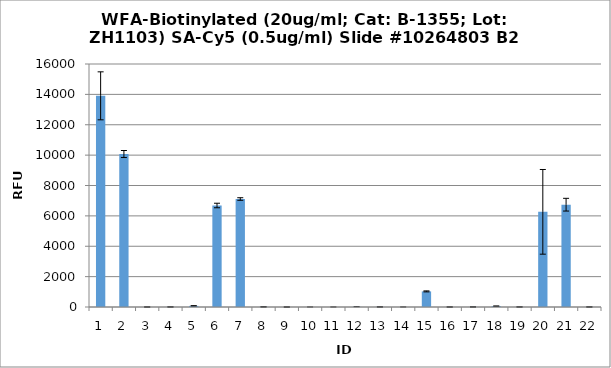
| Category | Series 0 |
|---|---|
| 0 | 13904.25 |
| 1 | 10072.25 |
| 2 | 1 |
| 3 | 4.5 |
| 4 | 73.25 |
| 5 | 6684 |
| 6 | 7110.25 |
| 7 | 8.75 |
| 8 | -3.5 |
| 9 | 0 |
| 10 | 0.5 |
| 11 | 9.75 |
| 12 | 5.5 |
| 13 | 0.75 |
| 14 | 1027.75 |
| 15 | 1 |
| 16 | 4.5 |
| 17 | 55 |
| 18 | 3.25 |
| 19 | 6265.75 |
| 20 | 6736.75 |
| 21 | 3.25 |